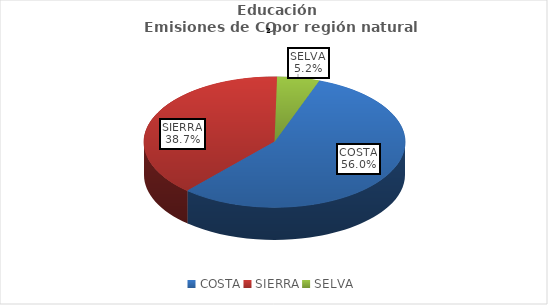
| Category | Series 0 |
|---|---|
| COSTA | 154047.088 |
| SIERRA | 106573.374 |
| SELVA | 14413.182 |